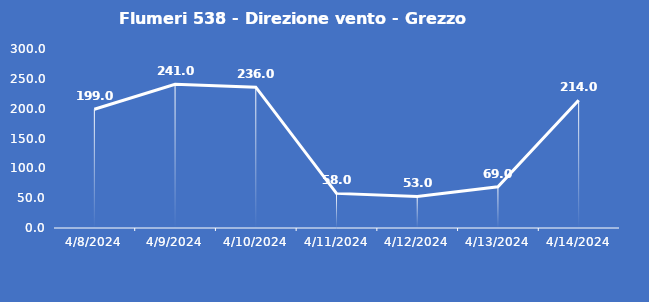
| Category | Flumeri 538 - Direzione vento - Grezzo (°N) |
|---|---|
| 4/8/24 | 199 |
| 4/9/24 | 241 |
| 4/10/24 | 236 |
| 4/11/24 | 58 |
| 4/12/24 | 53 |
| 4/13/24 | 69 |
| 4/14/24 | 214 |